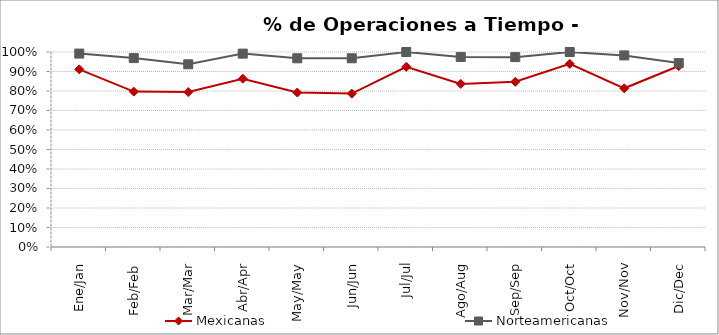
| Category | Mexicanas | Norteamericanas |
|---|---|---|
| Ene/Jan | 0.911 | 0.992 |
| Feb/Feb | 0.797 | 0.969 |
| Mar/Mar | 0.795 | 0.937 |
| Abr/Apr | 0.863 | 0.992 |
| May/May | 0.792 | 0.968 |
| Jun/Jun | 0.787 | 0.968 |
| Jul/Jul | 0.924 | 1 |
| Ago/Aug | 0.836 | 0.975 |
| Sep/Sep | 0.847 | 0.974 |
| Oct/Oct | 0.939 | 1 |
| Nov/Nov | 0.814 | 0.982 |
| Dic/Dec | 0.928 | 0.943 |